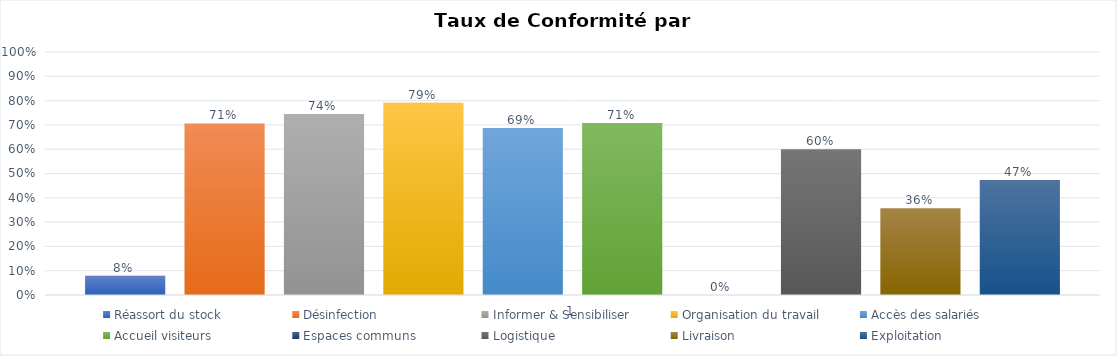
| Category | Réassort du stock | Désinfection | Informer & Sensibiliser | Organisation du travail | Accès des salariés | Accueil visiteurs | Espaces communs | Logistique | Livraison | Exploitation |
|---|---|---|---|---|---|---|---|---|---|---|
| 0 | 0.079 | 0.706 | 0.745 | 0.792 | 0.688 | 0.708 | 0 | 0.6 | 0.357 | 0.474 |